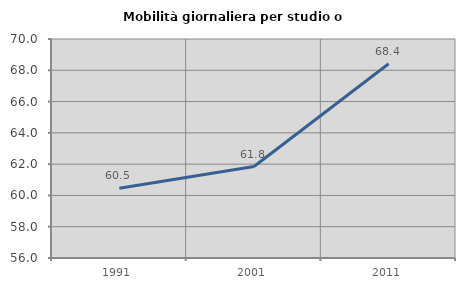
| Category | Mobilità giornaliera per studio o lavoro |
|---|---|
| 1991.0 | 60.457 |
| 2001.0 | 61.848 |
| 2011.0 | 68.421 |